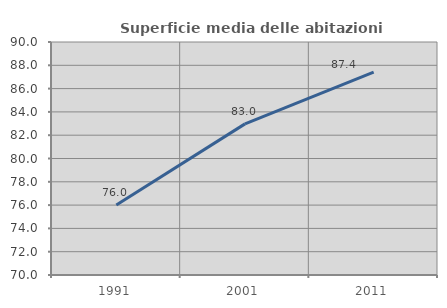
| Category | Superficie media delle abitazioni occupate |
|---|---|
| 1991.0 | 76.016 |
| 2001.0 | 82.972 |
| 2011.0 | 87.422 |